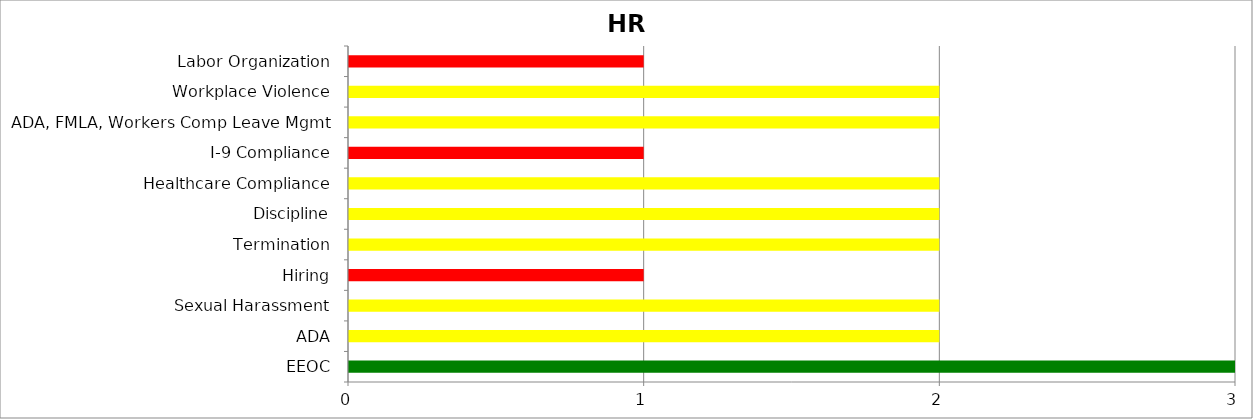
| Category | Low | Medium | High |
|---|---|---|---|
| EEOC | 3 | 0 | 0 |
| ADA | 0 | 2 | 0 |
| Sexual Harassment | 0 | 2 | 0 |
| Hiring | 0 | 0 | 1 |
| Termination | 0 | 2 | 0 |
| Discipline | 0 | 2 | 0 |
| Healthcare Compliance | 0 | 2 | 0 |
| I-9 Compliance | 0 | 0 | 1 |
| ADA, FMLA, Workers Comp Leave Mgmt | 0 | 2 | 0 |
| Workplace Violence | 0 | 2 | 0 |
| Labor Organization | 0 | 0 | 1 |